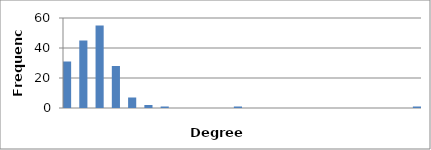
| Category | 31 |
|---|---|
| 1.0 | 31 |
| 1.4651162790697674 | 0 |
| 1.9302325581395348 | 45 |
| 2.395348837209302 | 0 |
| 2.8604651162790695 | 55 |
| 3.325581395348837 | 0 |
| 3.7906976744186043 | 28 |
| 4.255813953488372 | 0 |
| 4.720930232558139 | 7 |
| 5.186046511627906 | 0 |
| 5.651162790697674 | 2 |
| 6.116279069767441 | 0 |
| 6.581395348837209 | 1 |
| 7.046511627906976 | 0 |
| 7.511627906976743 | 0 |
| 7.976744186046511 | 0 |
| 8.441860465116278 | 0 |
| 8.906976744186046 | 0 |
| 9.372093023255815 | 0 |
| 9.837209302325583 | 0 |
| 10.302325581395351 | 0 |
| 10.76744186046512 | 1 |
| 11.232558139534888 | 0 |
| 11.697674418604656 | 0 |
| 12.162790697674424 | 0 |
| 12.627906976744192 | 0 |
| 13.09302325581396 | 0 |
| 13.558139534883729 | 0 |
| 14.023255813953497 | 0 |
| 14.488372093023266 | 0 |
| 14.953488372093034 | 0 |
| 15.418604651162802 | 0 |
| 15.88372093023257 | 0 |
| 16.34883720930234 | 0 |
| 16.813953488372107 | 0 |
| 17.279069767441875 | 0 |
| 17.744186046511643 | 0 |
| 18.20930232558141 | 0 |
| 18.67441860465118 | 0 |
| 19.13953488372095 | 0 |
| 19.604651162790717 | 0 |
| 20.069767441860485 | 0 |
| 20.534883720930253 | 0 |
| 21.0 | 1 |